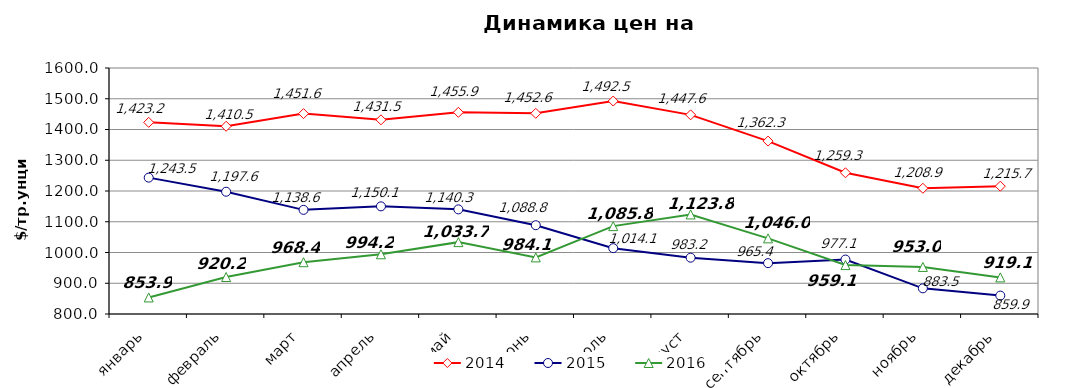
| Category | 2014 | 2015 | 2016 |
|---|---|---|---|
| январь | 1423.18 | 1243.48 | 853.85 |
| февраль | 1410.5 | 1197.6 | 920.24 |
| март | 1451.62 | 1138.64 | 968.43 |
| апрель | 1431.5 | 1150.1 | 994.19 |
| май | 1455.89 | 1140.26 | 1033.7 |
| июнь | 1452.57 | 1088.77 | 984.14 |
| июль | 1492.48 | 1014.09 | 1085.76 |
| август | 1447.64 | 983.15 | 1123.77 |
| сентябрь | 1362.29 | 965.36 | 1045.95 |
| октябрь | 1259.34 | 977.09 | 959.14 |
| ноябрь | 1208.85 | 883.52 | 953 |
| декабрь | 1215.67 | 859.9 | 919.05 |